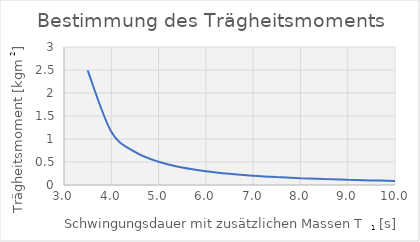
| Category | Series 0 |
|---|---|
| 3.5 | 2.492 |
| 4.0 | 1.157 |
| 4.5 | 0.72 |
| 5.0 | 0.506 |
| 5.5 | 0.381 |
| 6.0 | 0.3 |
| 6.5 | 0.244 |
| 7.0 | 0.202 |
| 7.5 | 0.171 |
| 8.0 | 0.147 |
| 8.5 | 0.128 |
| 9.0 | 0.112 |
| 9.5 | 0.1 |
| 10.0 | 0.089 |